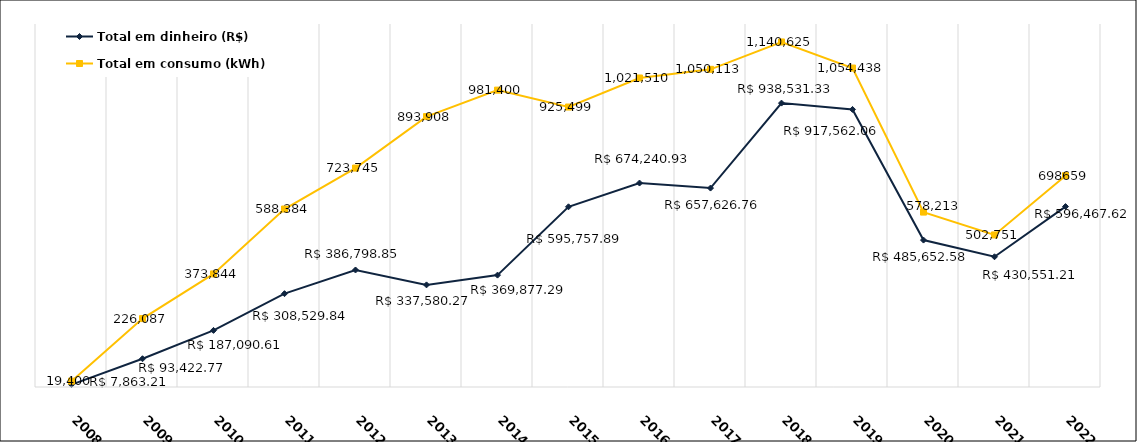
| Category | Total em dinheiro (R$) | Total em consumo (kWh) |
|---|---|---|
| 2008.0 | 7863.21 | 19400 |
| 2009.0 | 93422.77 | 226087 |
| 2010.0 | 187090.61 | 373844 |
| 2011.0 | 308529.84 | 588384 |
| 2012.0 | 386798.85 | 723745 |
| 2013.0 | 337580.27 | 893908 |
| 2014.0 | 369877.29 | 981400 |
| 2015.0 | 595757.89 | 925499 |
| 2016.0 | 674240.93 | 1021510 |
| 2017.0 | 657626.76 | 1050113 |
| 2018.0 | 938531.33 | 1140625 |
| 2019.0 | 917562.06 | 1054438 |
| 2020.0 | 485652.58 | 578213 |
| 2021.0 | 430551.21 | 502751 |
| 2022.0 | 596467.62 | 698659 |